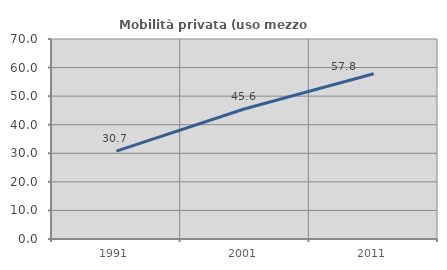
| Category | Mobilità privata (uso mezzo privato) |
|---|---|
| 1991.0 | 30.733 |
| 2001.0 | 45.592 |
| 2011.0 | 57.813 |